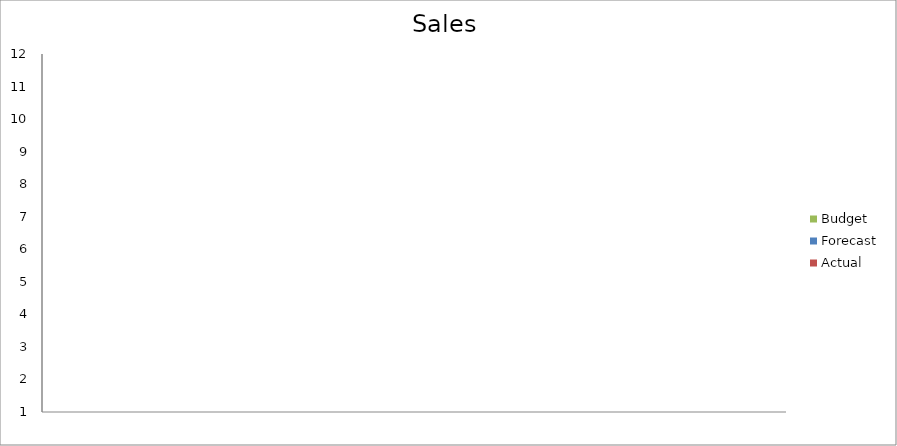
| Category | Budget | Forecast | Actual |
|---|---|---|---|
| 0 | 1540 | 3470 | 1910 |
| 1 | 2370 | 2320 | 1020 |
| 2 | 2820 | 850 | 1170 |
| 3 | 1000 | 780 | 3250 |
| 4 | 2030 | 690 | 1360 |
| 5 | 2460 | 2520 | 2170 |
| 6 | 3140 | 2140 | 1430 |
| 7 | 3110 | 3040 | 1640 |
| 8 | 2810 | 1820 | 640 |
| 9 | 1280 | 1850 | 1610 |
| 10 | 2280 | 1010 | 2230 |
| 11 | 650 | 1480 | 1050 |